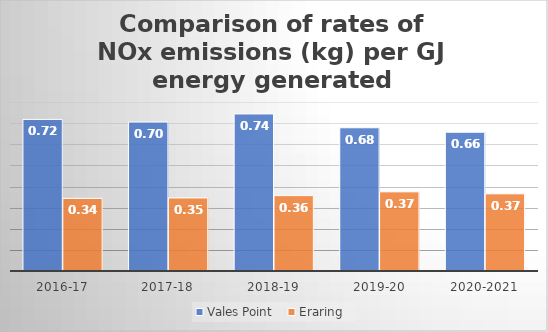
| Category | Vales Point  |  Eraring   |
|---|---|---|
| 2016-17 | 0.718 | 0.344 |
| 2017-18 | 0.705 | 0.346 |
| 2018-19 | 0.744 | 0.357 |
| 2019-20 | 0.678 | 0.375 |
| 2020-2021 | 0.657 | 0.365 |